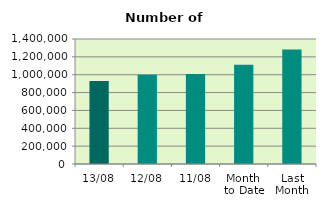
| Category | Series 0 |
|---|---|
| 13/08 | 930186 |
| 12/08 | 998952 |
| 11/08 | 1008780 |
| Month 
to Date | 1112489.8 |
| Last
Month | 1281605.545 |